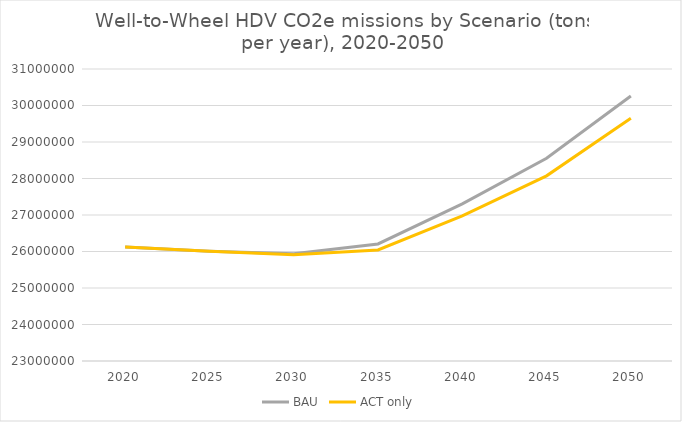
| Category | BAU | ACT only |
|---|---|---|
| 2020.0 | 26124821.458 | 26124821.458 |
| 2025.0 | 26009683.223 | 26009683.223 |
| 2030.0 | 25941069.742 | 25910566.015 |
| 2035.0 | 26207199.31 | 26044060.878 |
| 2040.0 | 27303921.076 | 26975157.387 |
| 2045.0 | 28553965.109 | 28072379.071 |
| 2050.0 | 30262246.478 | 29649103.124 |